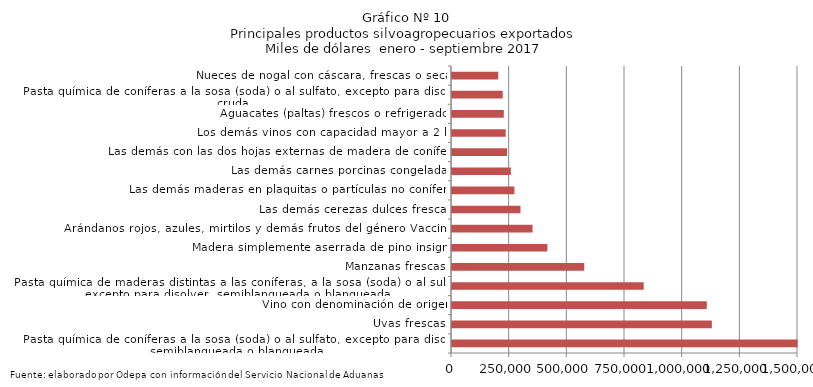
| Category | Series 0 |
|---|---|
| Pasta química de coníferas a la sosa (soda) o al sulfato, excepto para disolver, semiblanqueada o blanqueada | 1498380.746 |
| Uvas frescas | 1126596.65 |
| Vino con denominación de origen | 1104632.218 |
| Pasta química de maderas distintas a las coníferas, a la sosa (soda) o al sulfato, excepto para disolver, semiblanqueada o blanqueada | 831021.428 |
| Manzanas frescas | 573237.39 |
| Madera simplemente aserrada de pino insigne | 413552.635 |
| Arándanos rojos, azules, mirtilos y demás frutos del género Vaccinium | 349127.937 |
| Las demás cerezas dulces frescas | 296864.269 |
| Las demás maderas en plaquitas o partículas no coníferas | 270474.393 |
| Las demás carnes porcinas congeladas | 255043.608 |
| Las demás con las dos hojas externas de madera de coníferas | 238532.519 |
| Los demás vinos con capacidad mayor a 2 lts | 232870.282 |
| Aguacates (paltas) frescos o refrigerados | 224615.549 |
| Pasta química de coníferas a la sosa (soda) o al sulfato, excepto para disolver, cruda | 219783.828 |
| Nueces de nogal con cáscara, frescas o secas | 200403.726 |